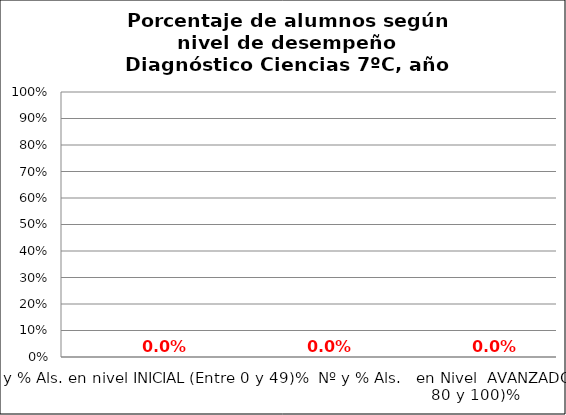
| Category | Series 0 | Series 1 | Series 2 | Series 3 |
|---|---|---|---|---|
| Nº y % Als. en nivel INICIAL (Entre 0 y 49)% |  |  |  | 0 |
| Nº y % Als.   en Nivel    INTERMEDIO (Entre 50 y 79)% |  |  |  | 0 |
| Nº y % Als.   en Nivel  AVANZADO    (Entre 80 y 100)% |  |  |  | 0 |